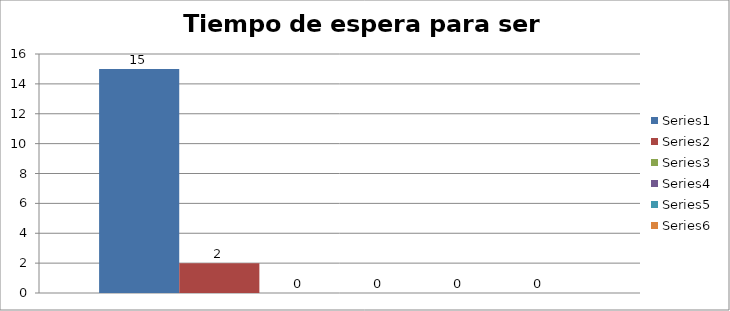
| Category | Series 0 | Series 1 | Series 2 | Series 3 | Series 4 | Series 5 |
|---|---|---|---|---|---|---|
| 0 | 15 | 2 | 0 | 0 | 0 | 0 |